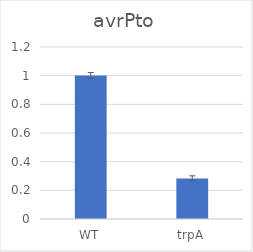
| Category | Series 0 |
|---|---|
| WT | 1.001 |
| trpA | 0.283 |